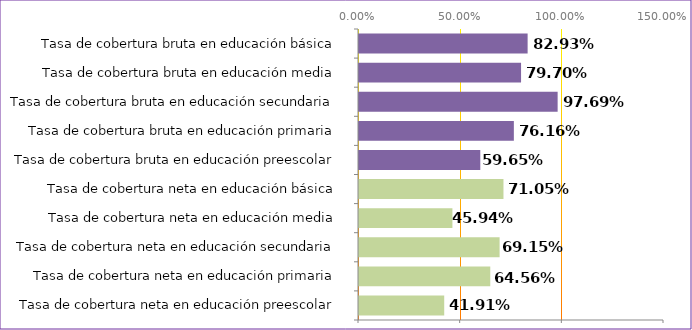
| Category | Series 0 |
|---|---|
| Tasa de cobertura neta en educación preescolar | 0.419 |
| Tasa de cobertura neta en educación primaria | 0.646 |
| Tasa de cobertura neta en educación secundaria | 0.692 |
| Tasa de cobertura neta en educación media | 0.459 |
| Tasa de cobertura neta en educación básica | 0.71 |
| Tasa de cobertura bruta en educación preescolar | 0.596 |
| Tasa de cobertura bruta en educación primaria | 0.762 |
| Tasa de cobertura bruta en educación secundaria | 0.977 |
| Tasa de cobertura bruta en educación media | 0.797 |
| Tasa de cobertura bruta en educación básica | 0.829 |